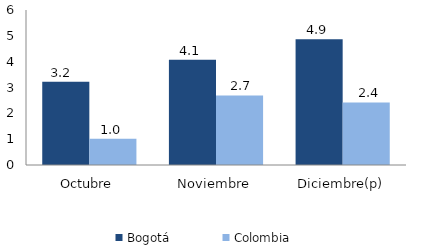
| Category | Bogotá | Colombia |
|---|---|---|
| Octubre | 3.219 | 1.012 |
| Noviembre | 4.071 | 2.694 |
| Diciembre(p) | 4.865 | 2.424 |